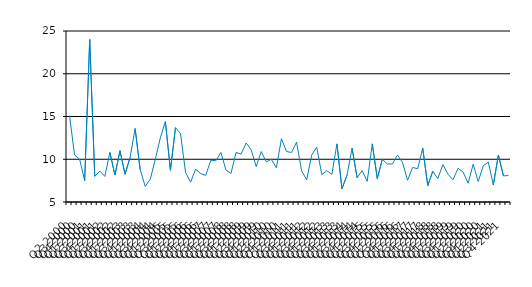
| Category | Series 0 |
|---|---|
| Q2 2000 | 15.1 |
| Q3 2000 | 10.5 |
| Q4 2000 | 10 |
| Q1 2001 | 7.5 |
| Q2 2001 | 24 |
| Q3 2001 | 8 |
| Q4 2001 | 8.62 |
| Q1 2002 | 8 |
| Q2 2002 | 10.8 |
| Q3 2002 | 8.16 |
| Q4 2002 | 11 |
| Q1 2003 | 8.25 |
| Q2 2003 | 10.2 |
| Q3 2003 | 13.6 |
| Q4 2003 | 8.8 |
| Q1 2004 | 6.83 |
| Q2 2004 | 7.66 |
| Q3 2004 | 10 |
| Q4 2004 | 12.5 |
| Q1 2005 | 14.4 |
| Q2 2005 | 8.71 |
| Q3 2005 | 13.7 |
| Q4 2005 | 13 |
| Q1 2006 | 8.44 |
| Q2 2006 | 7.33 |
| Q3 2006 | 8.83 |
| Q4 2006 | 8.33 |
| Q1 2007 | 8.11 |
| Q2 2007 | 9.88 |
| Q3 2007 | 9.82 |
| Q4 2007 | 10.8 |
| Q1 2008 | 8.75 |
| Q2 2008 | 8.33 |
| Q3 2008 | 10.8 |
| Q4 2008 | 10.6 |
| Q1 2009 | 11.9 |
| Q2 2009 | 11.1 |
| Q3 2009 | 9.13 |
| Q4 2009 | 10.9 |
| Q1 2010 | 9.69 |
| Q2 2010 | 10 |
| Q3 2010 | 9 |
| Q4 2010 | 12.4 |
| Q1 2011 | 10.9 |
| Q2 2011 | 10.8 |
| Q3 2011 | 12 |
| Q4 2011 | 8.64 |
| Q1 2012 | 7.6 |
| Q2 2012 | 10.5 |
| Q3 2012 | 11.4 |
| Q4 2012 | 8.2 |
| Q1 2013 | 8.65 |
| Q2 2013 | 8.24 |
| Q3 2013 | 11.8 |
| Q4 2013 | 6.55 |
| Q1 2014 | 8.14 |
| Q2 2014 | 11.3 |
| Q3 2014 | 7.83 |
| Q4 2014 | 8.67 |
| Q1 2015 | 7.42 |
| Q2 2015 | 11.8 |
| Q3 2015 | 7.74 |
| Q4 2015 | 10 |
| Q1 2016 | 9.44 |
| Q2 2016 | 9.45 |
| Q3 2016 | 10.5 |
| Q4 2016 | 9.62 |
| Q1 2017 | 7.54 |
| Q2 2017 | 9.04 |
| Q3 2017 | 8.89 |
| Q4 2017 | 11.3 |
| Q1 2018 | 6.91 |
| Q2 2018 | 8.6 |
| Q3 2018 | 7.74 |
| Q4 2018 | 9.38 |
| Q1 2019 | 8.26 |
| Q2 2019 | 7.6 |
| Q3 2019 | 8.941 |
| Q4 2019 | 8.5 |
| Q1 2020 | 7.19 |
| Q2 2020 | 9.41 |
| Q3 2020 | 7.4 |
| Q4 2020 | 9.25 |
| Q1 2021 | 9.67 |
| Q2 2021 | 7 |
| Q3 2021 | 10.5 |
| Q4 2021 | 8.05 |